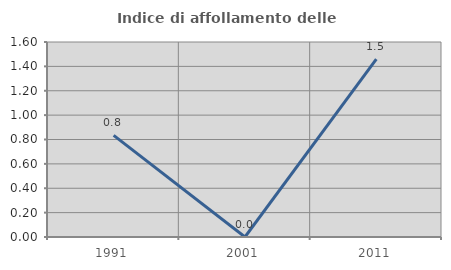
| Category | Indice di affollamento delle abitazioni  |
|---|---|
| 1991.0 | 0.833 |
| 2001.0 | 0 |
| 2011.0 | 1.46 |